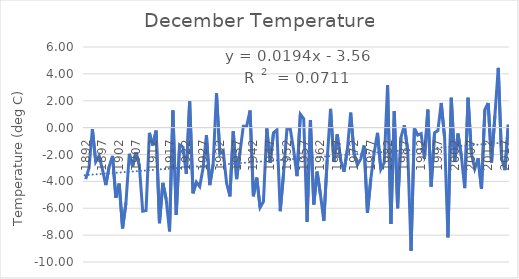
| Category | Series 0 |
|---|---|
| 1892.0 | -3.833 |
| 1893.0 | -3 |
| 1894.0 | -0.111 |
| 1895.0 | -2.556 |
| 1896.0 | -2.111 |
| 1897.0 | -3.111 |
| 1898.0 | -4.278 |
| 1899.0 | -2.889 |
| 1900.0 | -2.111 |
| 1901.0 | -5.222 |
| 1902.0 | -4.167 |
| 1903.0 | -7.5 |
| 1904.0 | -5.611 |
| 1905.0 | -1.944 |
| 1906.0 | -2.889 |
| 1907.0 | -1.833 |
| 1908.0 | -2.833 |
| 1909.0 | -6.222 |
| 1910.0 | -6.167 |
| 1911.0 | -0.389 |
| 1912.0 | -1.333 |
| 1913.0 | -0.222 |
| 1914.0 | -7.111 |
| 1915.0 | -4.111 |
| 1916.0 | -5.333 |
| 1917.0 | -7.722 |
| 1918.0 | 1.278 |
| 1919.0 | -6.5 |
| 1920.0 | -1.278 |
| 1921.0 | -1.444 |
| 1922.0 | -3.444 |
| 1923.0 | 1.944 |
| 1924.0 | -4.889 |
| 1925.0 | -4.056 |
| 1926.0 | -4.389 |
| 1927.0 | -3 |
| 1928.0 | -0.556 |
| 1929.0 | -4.278 |
| 1930.0 | -2.722 |
| 1931.0 | 2.556 |
| 1932.0 | -1.944 |
| 1933.0 | -1.722 |
| 1934.0 | -4.111 |
| 1935.0 | -5.111 |
| 1936.0 | -0.278 |
| 1937.0 | -3.833 |
| 1938.0 | -1.833 |
| 1939.0 | 0.111 |
| 1940.0 | 0.111 |
| 1941.0 | 1.278 |
| 1942.0 | -5.111 |
| 1943.0 | -3.722 |
| 1944.0 | -5.944 |
| 1945.0 | -5.5 |
| 1946.0 | -0.056 |
| 1947.0 | -2.611 |
| 1948.0 | -0.389 |
| 1949.0 | -0.167 |
| 1950.0 | -6.222 |
| 1951.0 | -3.389 |
| 1952.0 | -0.111 |
| 1953.0 | -0.111 |
| 1954.0 | -1.667 |
| 1955.0 | -3.611 |
| 1956.0 | 1 |
| 1957.0 | 0.667 |
| 1958.0 | -7 |
| 1959.0 | 0.556 |
| 1960.0 | -5.722 |
| 1961.0 | -3.278 |
| 1962.0 | -5 |
| 1963.0 | -6.944 |
| 1964.0 | -2.389 |
| 1965.0 | 1.389 |
| 1966.0 | -2.556 |
| 1967.0 | -0.5 |
| 1968.0 | -2.389 |
| 1969.0 | -3.278 |
| 1970.0 | -1.667 |
| 1971.0 | 1.111 |
| 1972.0 | -1.889 |
| 1973.0 | -2.778 |
| 1974.0 | -2.333 |
| 1975.0 | -1.333 |
| 1976.0 | -6.333 |
| 1977.0 | -3.833 |
| 1978.0 | -1.889 |
| 1979.0 | -0.389 |
| 1980.0 | -3.111 |
| 1981.0 | -2.611 |
| 1982.0 | 3.167 |
| 1983.0 | -7.167 |
| 1984.0 | 1.222 |
| 1985.0 | -6 |
| 1986.0 | -0.722 |
| 1987.0 | 0.167 |
| 1988.0 | -1.667 |
| 1989.0 | -9.167 |
| 1990.0 | -0.056 |
| 1991.0 | -0.556 |
| 1992.0 | -0.444 |
| 1993.0 | -2.333 |
| 1994.0 | 1.333 |
| 1995.0 | -4.389 |
| 1996.0 | -0.389 |
| 1997.0 | -0.222 |
| 1998.0 | 1.833 |
| 1999.0 | -0.722 |
| 2000.0 | -8.167 |
| 2001.0 | 2.222 |
| 2002.0 | -2.556 |
| 2003.0 | -0.444 |
| 2004.0 | -2.111 |
| 2005.0 | -4.5 |
| 2006.0 | 2.222 |
| 2007.0 | -1.944 |
| 2008.0 | -3.056 |
| 2009.0 | -2.278 |
| 2010.0 | -4.556 |
| 2011.0 | 1.333 |
| 2012.0 | 1.833 |
| 2013.0 | -2.611 |
| 2014.0 | 0.89 |
| 2015.0 | 4.444 |
| 2016.0 | -2.278 |
| 2017.0 | -3.167 |
| 2018.0 | 0.222 |